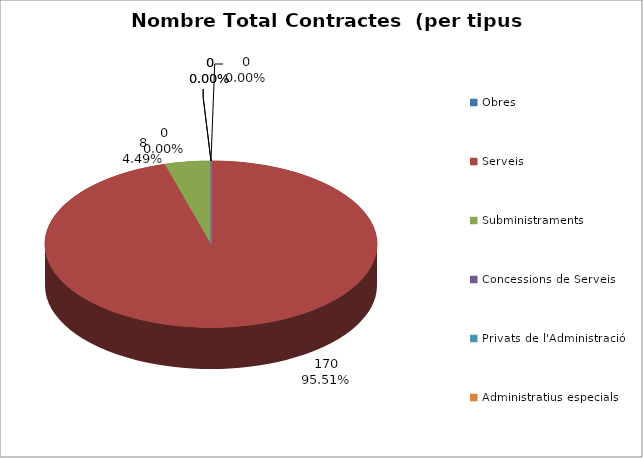
| Category | Nombre Total Contractes |
|---|---|
| Obres | 0 |
| Serveis | 170 |
| Subministraments | 8 |
| Concessions de Serveis | 0 |
| Privats de l'Administració | 0 |
| Administratius especials | 0 |